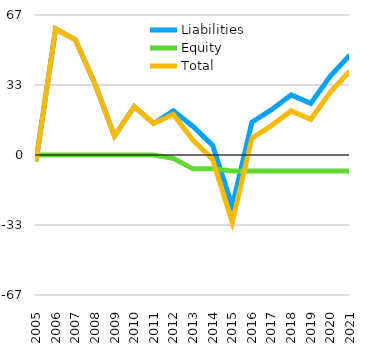
| Category | Liabilities  | Equity  | Total  |
|---|---|---|---|
| 2005 | -3 | 0 | -3 |
| 2006 | 60 | 0 | 60 |
| 2007 | 55 | 0 | 55 |
| 2008 | 34 | 0 | 34 |
| 2009 | 9 | 0 | 9 |
| 2010 | 23 | 0 | 23 |
| 2011 | 15 | 0 | 15 |
| 2012 | 21 | -1.6 | 19.4 |
| 2013 | 13.6 | -6.6 | 7 |
| 2014 | 4.6 | -6.6 | -2 |
| 2015 | -24.4 | -7.6 | -32 |
| 2016 | 15.6 | -7.6 | 8 |
| 2017 | 21.6 | -7.6 | 14 |
| 2018 | 28.6 | -7.6 | 21 |
| 2019 | 24.6 | -7.6 | 17 |
| 2020 | 37.6 | -7.6 | 30 |
| 2021 | 47.6 | -7.6 | 40 |